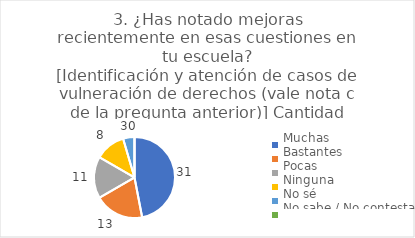
| Category | 3. ¿Has notado mejoras recientemente en esas cuestiones en tu escuela?
[Identificación y atención de casos de vulneración de derechos (vale nota c de la pregunta anterior)] |
|---|---|
| Muchas  | 0.47 |
| Bastantes  | 0.197 |
| Pocas  | 0.167 |
| Ninguna  | 0.121 |
| No sé  | 0.045 |
| No sabe / No contesta | 0 |